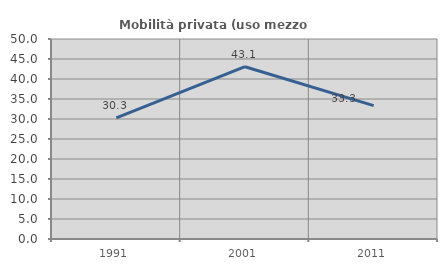
| Category | Mobilità privata (uso mezzo privato) |
|---|---|
| 1991.0 | 30.263 |
| 2001.0 | 43.077 |
| 2011.0 | 33.333 |